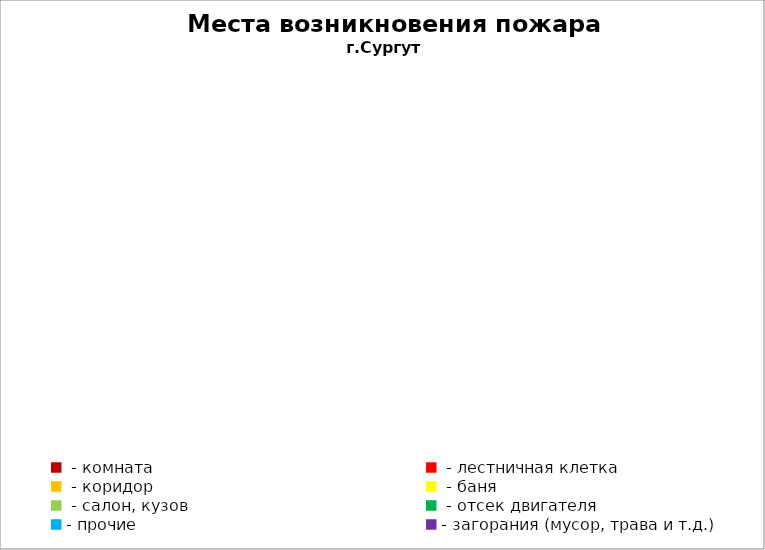
| Category | Места возникновения пожара |
|---|---|
|  - комната | 52 |
|  - лестничная клетка | 12 |
|  - коридор | 9 |
|  - баня | 30 |
|  - салон, кузов | 20 |
|  - отсек двигателя | 34 |
| - прочие | 73 |
| - загорания (мусор, трава и т.д.)  | 142 |